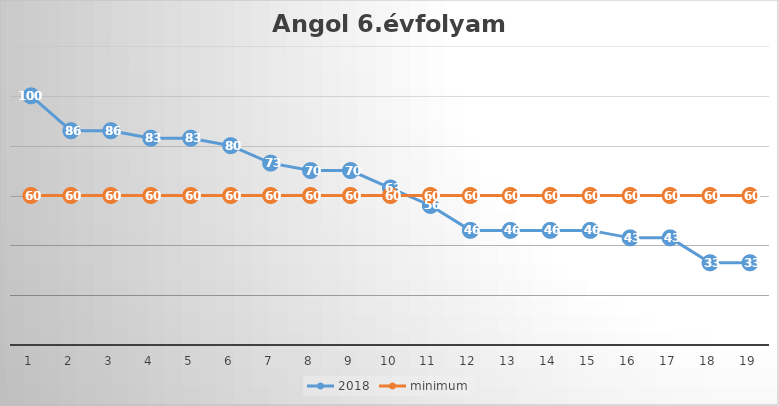
| Category | 2018 | minimum |
|---|---|---|
| 0 | 100 | 60 |
| 1 | 86 | 60 |
| 2 | 86 | 60 |
| 3 | 83 | 60 |
| 4 | 83 | 60 |
| 5 | 80 | 60 |
| 6 | 73 | 60 |
| 7 | 70 | 60 |
| 8 | 70 | 60 |
| 9 | 63 | 60 |
| 10 | 56 | 60 |
| 11 | 46 | 60 |
| 12 | 46 | 60 |
| 13 | 46 | 60 |
| 14 | 46 | 60 |
| 15 | 43 | 60 |
| 16 | 43 | 60 |
| 17 | 33 | 60 |
| 18 | 33 | 60 |